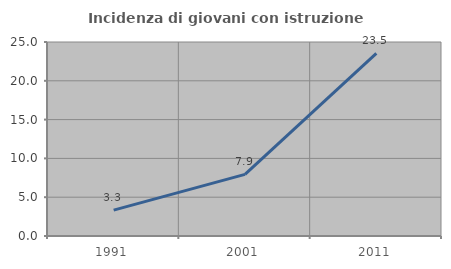
| Category | Incidenza di giovani con istruzione universitaria |
|---|---|
| 1991.0 | 3.333 |
| 2001.0 | 7.937 |
| 2011.0 | 23.529 |